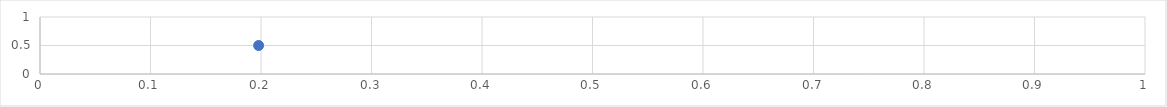
| Category | Series 0 |
|---|---|
| 0.19786063999583856 | 0.5 |